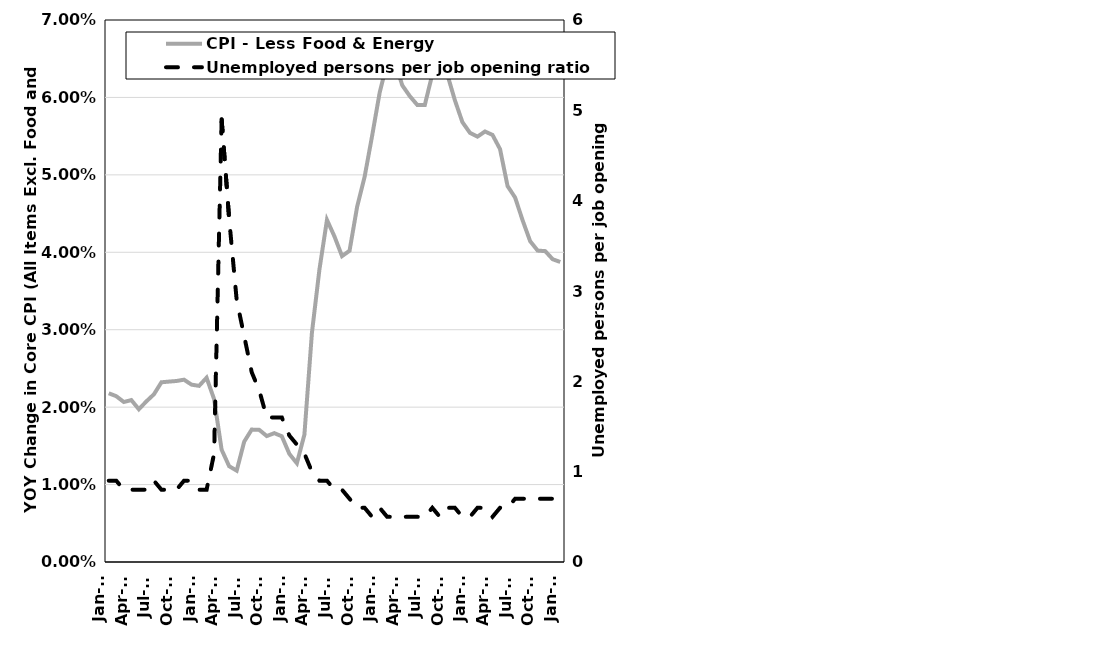
| Category | CPI - Less Food & Energy |
|---|---|
| 2019-01-01 | 0.022 |
| 2019-02-01 | 0.021 |
| 2019-03-01 | 0.021 |
| 2019-04-01 | 0.021 |
| 2019-05-01 | 0.02 |
| 2019-06-01 | 0.021 |
| 2019-07-01 | 0.022 |
| 2019-08-01 | 0.023 |
| 2019-09-01 | 0.023 |
| 2019-10-01 | 0.023 |
| 2019-11-01 | 0.024 |
| 2019-12-01 | 0.023 |
| 2020-01-01 | 0.023 |
| 2020-02-01 | 0.024 |
| 2020-03-01 | 0.021 |
| 2020-04-01 | 0.015 |
| 2020-05-01 | 0.012 |
| 2020-06-01 | 0.012 |
| 2020-07-01 | 0.016 |
| 2020-08-01 | 0.017 |
| 2020-09-01 | 0.017 |
| 2020-10-01 | 0.016 |
| 2020-11-01 | 0.017 |
| 2020-12-01 | 0.016 |
| 2021-01-01 | 0.014 |
| 2021-02-01 | 0.013 |
| 2021-03-01 | 0.016 |
| 2021-04-01 | 0.03 |
| 2021-05-01 | 0.038 |
| 2021-06-01 | 0.044 |
| 2021-07-01 | 0.042 |
| 2021-08-01 | 0.04 |
| 2021-09-01 | 0.04 |
| 2021-10-01 | 0.046 |
| 2021-11-01 | 0.05 |
| 2021-12-01 | 0.055 |
| 2022-01-01 | 0.061 |
| 2022-02-01 | 0.065 |
| 2022-03-01 | 0.065 |
| 2022-04-01 | 0.062 |
| 2022-05-01 | 0.06 |
| 2022-06-01 | 0.059 |
| 2022-07-01 | 0.059 |
| 2022-08-01 | 0.063 |
| 2022-09-01 | 0.066 |
| 2022-10-01 | 0.063 |
| 2022-11-01 | 0.06 |
| 2022-12-01 | 0.057 |
| 2023-01-01 | 0.055 |
| 2023-02-01 | 0.055 |
| 2023-03-01 | 0.056 |
| 2023-04-01 | 0.055 |
| 2023-05-01 | 0.053 |
| 2023-06-01 | 0.049 |
| 2023-07-01 | 0.047 |
| 2023-08-01 | 0.044 |
| 2023-09-01 | 0.041 |
| 2023-10-01 | 0.04 |
| 2023-11-01 | 0.04 |
| 2023-12-01 | 0.039 |
| 2024-01-01 | 0.039 |